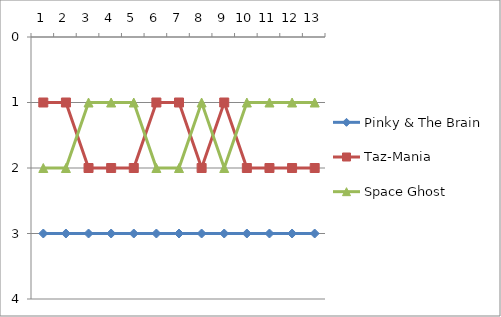
| Category | Pinky & The Brain | Taz-Mania | Space Ghost |
|---|---|---|---|
| 0 | 3 | 1 | 2 |
| 1 | 3 | 1 | 2 |
| 2 | 3 | 2 | 1 |
| 3 | 3 | 2 | 1 |
| 4 | 3 | 2 | 1 |
| 5 | 3 | 1 | 2 |
| 6 | 3 | 1 | 2 |
| 7 | 3 | 2 | 1 |
| 8 | 3 | 1 | 2 |
| 9 | 3 | 2 | 1 |
| 10 | 3 | 2 | 1 |
| 11 | 3 | 2 | 1 |
| 12 | 3 | 2 | 1 |